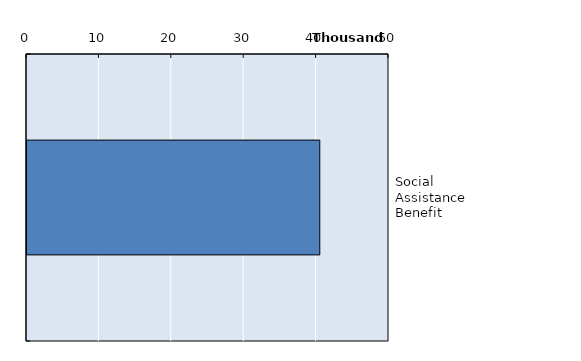
| Category | Series 0 |
|---|---|
| Social Assistance Benefit  | 40440 |